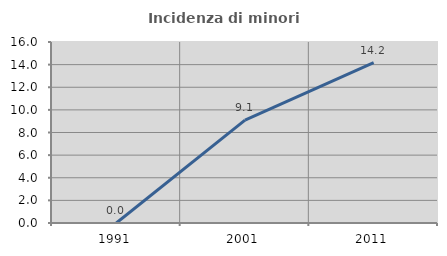
| Category | Incidenza di minori stranieri |
|---|---|
| 1991.0 | 0 |
| 2001.0 | 9.091 |
| 2011.0 | 14.173 |